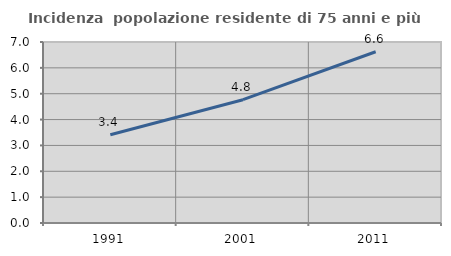
| Category | Incidenza  popolazione residente di 75 anni e più |
|---|---|
| 1991.0 | 3.414 |
| 2001.0 | 4.768 |
| 2011.0 | 6.624 |